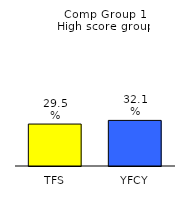
| Category | Series 0 |
|---|---|
| TFS | 0.295 |
| YFCY | 0.321 |